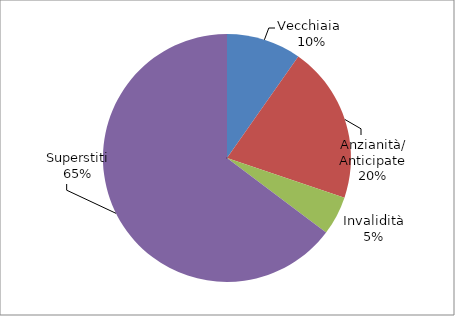
| Category | Series 0 |
|---|---|
| Vecchiaia  | 1951 |
| Anzianità/ Anticipate | 4089 |
| Invalidità | 1016 |
| Superstiti | 12950 |